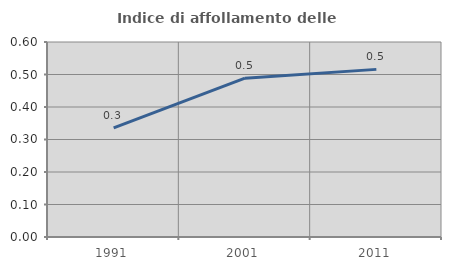
| Category | Indice di affollamento delle abitazioni  |
|---|---|
| 1991.0 | 0.336 |
| 2001.0 | 0.489 |
| 2011.0 | 0.516 |